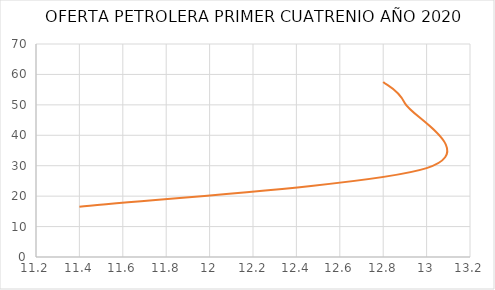
| Category | USD $ POR BARRIL |
|---|---|
| 12.8 | 57.52 |
| 12.9 | 50.54 |
| 13.0 | 29.21 |
| 11.4 | 16.55 |